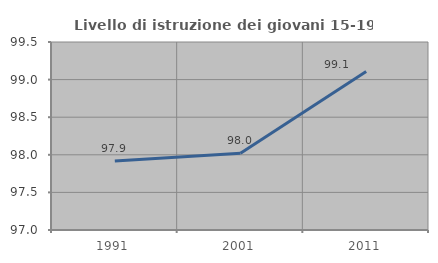
| Category | Livello di istruzione dei giovani 15-19 anni |
|---|---|
| 1991.0 | 97.917 |
| 2001.0 | 98.02 |
| 2011.0 | 99.107 |